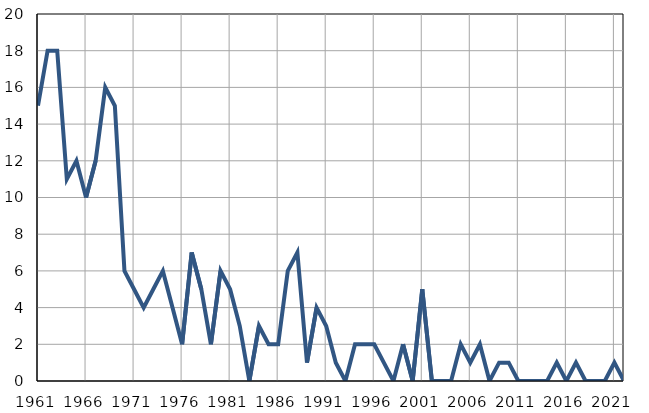
| Category | Infants
deaths |
|---|---|
| 1961.0 | 15 |
| 1962.0 | 18 |
| 1963.0 | 18 |
| 1964.0 | 11 |
| 1965.0 | 12 |
| 1966.0 | 10 |
| 1967.0 | 12 |
| 1968.0 | 16 |
| 1969.0 | 15 |
| 1970.0 | 6 |
| 1971.0 | 5 |
| 1972.0 | 4 |
| 1973.0 | 5 |
| 1974.0 | 6 |
| 1975.0 | 4 |
| 1976.0 | 2 |
| 1977.0 | 7 |
| 1978.0 | 5 |
| 1979.0 | 2 |
| 1980.0 | 6 |
| 1981.0 | 5 |
| 1982.0 | 3 |
| 1983.0 | 0 |
| 1984.0 | 3 |
| 1985.0 | 2 |
| 1986.0 | 2 |
| 1987.0 | 6 |
| 1988.0 | 7 |
| 1989.0 | 1 |
| 1990.0 | 4 |
| 1991.0 | 3 |
| 1992.0 | 1 |
| 1993.0 | 0 |
| 1994.0 | 2 |
| 1995.0 | 2 |
| 1996.0 | 2 |
| 1997.0 | 1 |
| 1998.0 | 0 |
| 1999.0 | 2 |
| 2000.0 | 0 |
| 2001.0 | 5 |
| 2002.0 | 0 |
| 2003.0 | 0 |
| 2004.0 | 0 |
| 2005.0 | 2 |
| 2006.0 | 1 |
| 2007.0 | 2 |
| 2008.0 | 0 |
| 2009.0 | 1 |
| 2010.0 | 1 |
| 2011.0 | 0 |
| 2012.0 | 0 |
| 2013.0 | 0 |
| 2014.0 | 0 |
| 2015.0 | 1 |
| 2016.0 | 0 |
| 2017.0 | 1 |
| 2018.0 | 0 |
| 2019.0 | 0 |
| 2020.0 | 0 |
| 2021.0 | 1 |
| 2022.0 | 0 |